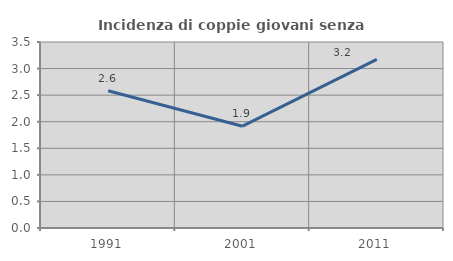
| Category | Incidenza di coppie giovani senza figli |
|---|---|
| 1991.0 | 2.583 |
| 2001.0 | 1.916 |
| 2011.0 | 3.175 |